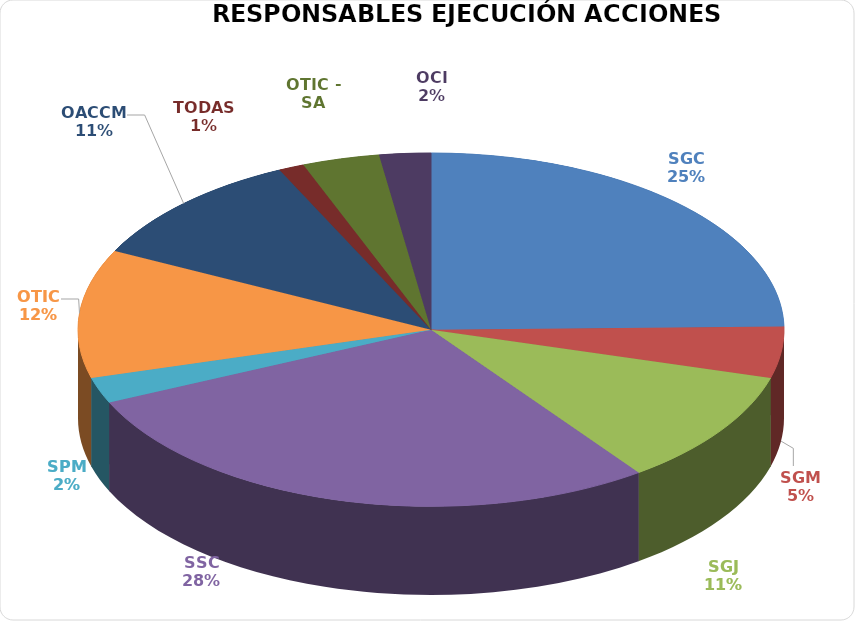
| Category | Series 0 |
|---|---|
| SGC | 21 |
| SGM | 4 |
| SGJ | 9 |
| SSC | 24 |
| SPM | 2 |
| OTIC | 10 |
| OACCM | 9 |
| TODAS | 1 |
| OTIC - SA | 3 |
| OCI | 2 |